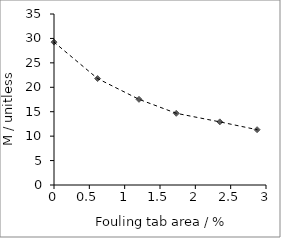
| Category | Series 0 |
|---|---|
| 0.0 | 29.249 |
| 0.6167266379343703 | 21.787 |
| 1.2026169439720222 | 17.538 |
| 1.7299182194059088 | 14.678 |
| 2.346644857340279 | 12.921 |
| 2.8739461327741656 | 11.319 |